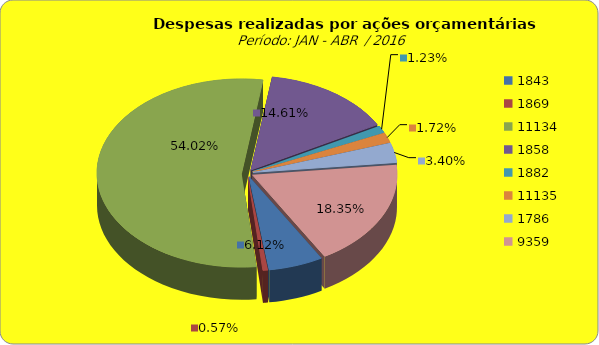
| Category | Series 1 |
|---|---|
| 1843.0 | 5477261.89 |
| 1869.0 | 508375.16 |
| 11134.0 | 48362210.61 |
| 1858.0 | 13078434.01 |
| 1882.0 | 1097555.3 |
| 11135.0 | 1538883.79 |
| 1786.0 | 3040689.03 |
| 9359.0 | 16428515.02 |